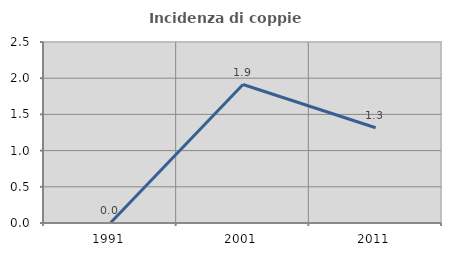
| Category | Incidenza di coppie miste |
|---|---|
| 1991.0 | 0 |
| 2001.0 | 1.913 |
| 2011.0 | 1.316 |